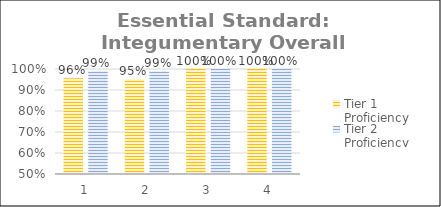
| Category | Tier 1 Proficiency | Tier 2 Proficiency |
|---|---|---|
| 0 | 0.956 | 0.991 |
| 1 | 0.951 | 0.99 |
| 2 | 1 | 1 |
| 3 | 1 | 1 |